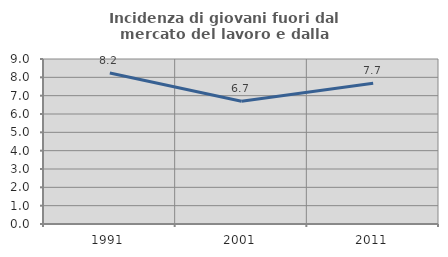
| Category | Incidenza di giovani fuori dal mercato del lavoro e dalla formazione  |
|---|---|
| 1991.0 | 8.239 |
| 2001.0 | 6.692 |
| 2011.0 | 7.674 |